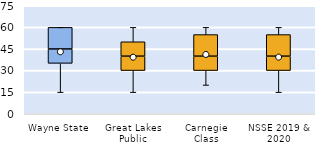
| Category | 25th | 50th | 75th |
|---|---|---|---|
| Wayne State | 35 | 10 | 15 |
| Great Lakes Public | 30 | 10 | 10 |
| Carnegie Class | 30 | 10 | 15 |
| NSSE 2019 & 2020 | 30 | 10 | 15 |